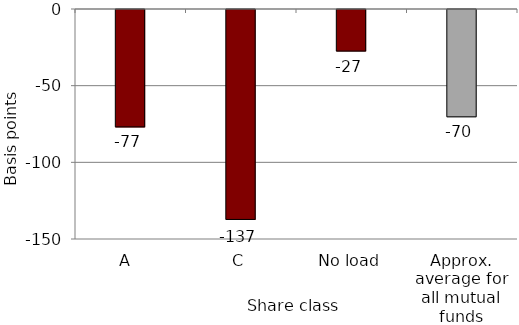
| Category | Average alpha |
|---|---|
| A  | -76.56 |
| C | -136.92 |
| No load | -27.12 |
| Approx. average for all mutual funds | -70 |